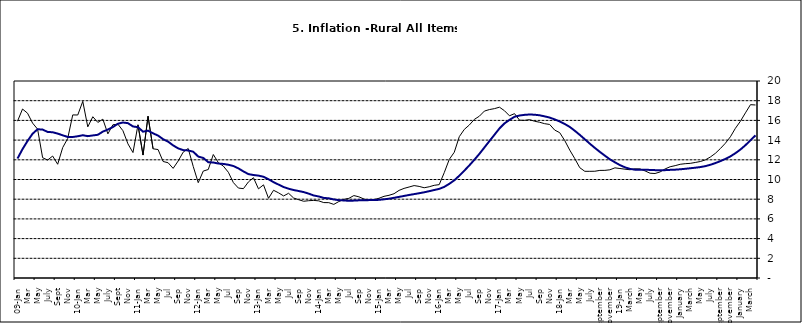
| Category | Series 0 | Series 1 |
|---|---|---|
| 09-Jan | 15.918 | 12.128 |
| Feb | 17.154 | 13.086 |
| Mar | 16.729 | 13.912 |
| Apr | 15.727 | 14.644 |
| May | 15.113 | 15.104 |
| June | 12.213 | 15.067 |
| July | 11.974 | 14.832 |
| Aug | 12.38 | 14.796 |
| Sept | 11.548 | 14.661 |
| Oct | 13.242 | 14.488 |
| Nov | 14.164 | 14.321 |
|  | 16.557 | 14.316 |
| 10-Jan | 16.548 | 14.39 |
| Feb | 17.934 | 14.494 |
| Mar | 15.346 | 14.401 |
| Apr | 16.373 | 14.473 |
| May | 15.794 | 14.54 |
| June | 16.126 | 14.862 |
| July | 14.634 | 15.072 |
| Aug | 15.556 | 15.33 |
| Sept | 15.616 | 15.658 |
| Oct | 14.955 | 15.786 |
| Nov | 13.616 | 15.719 |
| Dec | 12.735 | 15.385 |
| 11-Jan | 15.553 | 15.311 |
| Feb | 12.482 | 14.856 |
| Mar | 16.422 | 14.956 |
| Apr | 13.117 | 14.687 |
| May | 13.041 | 14.457 |
| Jun | 11.83 | 14.095 |
| Jul | 11.699 | 13.84 |
| Aug | 11.13 | 13.464 |
| Sep | 11.878 | 13.156 |
| Oct | 12.778 | 12.985 |
| Nov | 13.147 | 12.95 |
| Dec | 11.326 | 12.824 |
| 12-Jan | 9.678 | 12.33 |
| Feb | 10.856 | 12.188 |
| Mar | 11.014 | 11.76 |
| Apr | 12.536 | 11.724 |
| May | 11.712 | 11.621 |
| Jun | 11.36 | 11.582 |
| Jul | 10.733 | 11.499 |
| Aug | 9.683 | 11.368 |
| Sep | 9.132 | 11.131 |
| Oct | 9.071 | 10.82 |
| Nov | 9.758 | 10.548 |
| Dec | 10.183 | 10.455 |
| 13-Jan | 9.052 | 10.394 |
| Feb | 9.457 | 10.276 |
| Mar | 8.091 | 10.025 |
| Apr | 8.907 | 9.732 |
| May | 8.647 | 9.483 |
| Jun | 8.333 | 9.236 |
| Jul | 8.6 | 9.063 |
| Aug | 8.12 | 8.933 |
| Sep | 7.95 | 8.832 |
| Oct | 7.791 | 8.722 |
| Nov | 7.849 | 8.565 |
| Dec | 7.879 | 8.378 |
| 14-Jan | 7.832 | 8.277 |
| Feb | 7.657 | 8.13 |
| Mar | 7.65 | 8.092 |
| Apr | 7.473 | 7.973 |
| May | 7.761 | 7.901 |
| Jun | 7.98 | 7.874 |
| Jul | 8.086 | 7.834 |
| Aug | 8.368 | 7.858 |
| Sep | 8.244 | 7.883 |
| Oct | 8.019 | 7.903 |
| Nov | 7.898 | 7.906 |
| Dec | 7.955 | 7.913 |
| 15-Jan | 8.094 | 7.935 |
| Feb | 8.291 | 7.988 |
| Mar | 8.396 | 8.05 |
| Apr | 8.556 | 8.14 |
| May | 8.896 | 8.236 |
| Jun | 9.098 | 8.331 |
| Jul | 9.238 | 8.429 |
| Aug | 9.382 | 8.516 |
| Sep | 9.3 | 8.606 |
| Oct | 9.162 | 8.7 |
| Nov | 9.261 | 8.813 |
| Dec | 9.41 | 8.933 |
| 16-Jan | 9.48 | 9.047 |
| Feb | 10.692 | 9.249 |
| Mar | 12.038 | 9.559 |
| Apr | 12.767 | 9.917 |
| May | 14.349 | 10.384 |
| Jun | 15.088 | 10.897 |
| Jul | 15.533 | 11.433 |
| Aug | 16.103 | 12.002 |
| Sep | 16.428 | 12.601 |
| Oct | 16.947 | 13.25 |
| Nov | 17.099 | 13.898 |
| Dec | 17.195 | 14.54 |
| 17-Jan | 17.341 | 15.183 |
| Feb | 16.982 | 15.696 |
| Mar | 16.466 | 16.054 |
| Apr | 16.687 | 16.369 |
| May | 16.023 | 16.497 |
| Jun | 16.007 | 16.563 |
| Jul | 16.078 | 16.6 |
| Aug | 15.914 | 16.577 |
| Sep | 15.812 | 16.52 |
| Oct | 15.666 | 16.411 |
| Nov | 15.587 | 16.285 |
| Dec | 15.018 | 16.104 |
| 18-Jan | 14.756 | 15.892 |
| Feb | 13.957 | 15.638 |
| Mar | 12.987 | 15.339 |
| Apr | 12.126 | 14.95 |
| May | 11.199 | 14.53 |
| June | 10.832 | 14.083 |
| July | 10.831 | 13.636 |
| August | 10.838 | 13.209 |
| September | 10.924 | 12.804 |
| October | 10.927 | 12.418 |
| November | 10.986 | 12.049 |
| December | 11.183 | 11.746 |
| 19-Jan | 11.115 | 11.462 |
| February | 11.048 | 11.234 |
| March | 10.99 | 11.078 |
| April | 11.08 | 10.997 |
| May | 11.075 | 10.988 |
| June | 10.874 | 10.99 |
| July | 10.636 | 10.972 |
| August | 10.609 | 10.951 |
| September | 10.771 | 10.937 |
| October | 11.074 | 10.95 |
| November | 11.296 | 10.977 |
| December | 11.406 | 10.998 |
| January | 11.543 | 11.037 |
| February | 11.606 | 11.086 |
| March | 11.639 | 11.141 |
| April | 11.728 | 11.197 |
| May | 11.826 | 11.261 |
| June | 11.988 | 11.355 |
| July | 12.28 | 11.493 |
| August | 12.651 | 11.664 |
| September | 13.14 | 11.864 |
| October | 13.68 | 12.086 |
| November | 14.335 | 12.346 |
| December | 15.2 | 12.67 |
| January | 15.918 | 13.043 |
| February | 16.766 | 13.482 |
| March | 17.596 | 13.985 |
| April | 17.566 | 14.475 |